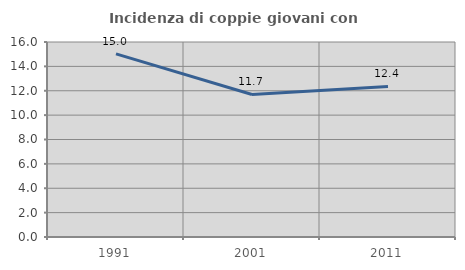
| Category | Incidenza di coppie giovani con figli |
|---|---|
| 1991.0 | 15.023 |
| 2001.0 | 11.693 |
| 2011.0 | 12.353 |